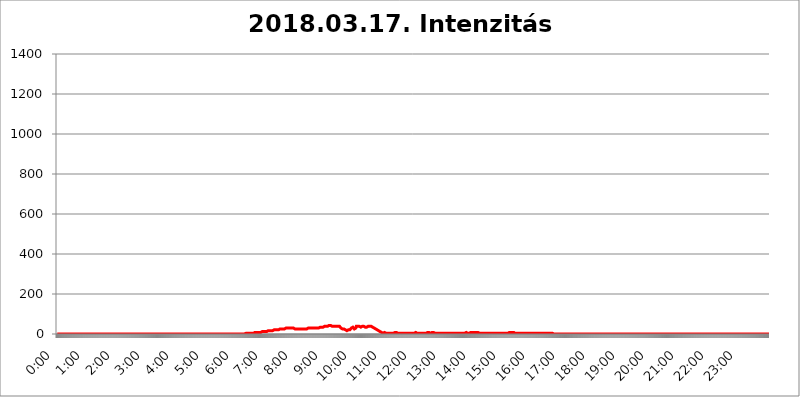
| Category | 2018.03.17. Intenzitás [W/m^2] |
|---|---|
| 0.0 | 0 |
| 0.0006944444444444445 | 0 |
| 0.001388888888888889 | 0 |
| 0.0020833333333333333 | 0 |
| 0.002777777777777778 | 0 |
| 0.003472222222222222 | 0 |
| 0.004166666666666667 | 0 |
| 0.004861111111111111 | 0 |
| 0.005555555555555556 | 0 |
| 0.0062499999999999995 | 0 |
| 0.006944444444444444 | 0 |
| 0.007638888888888889 | 0 |
| 0.008333333333333333 | 0 |
| 0.009027777777777779 | 0 |
| 0.009722222222222222 | 0 |
| 0.010416666666666666 | 0 |
| 0.011111111111111112 | 0 |
| 0.011805555555555555 | 0 |
| 0.012499999999999999 | 0 |
| 0.013194444444444444 | 0 |
| 0.013888888888888888 | 0 |
| 0.014583333333333332 | 0 |
| 0.015277777777777777 | 0 |
| 0.015972222222222224 | 0 |
| 0.016666666666666666 | 0 |
| 0.017361111111111112 | 0 |
| 0.018055555555555557 | 0 |
| 0.01875 | 0 |
| 0.019444444444444445 | 0 |
| 0.02013888888888889 | 0 |
| 0.020833333333333332 | 0 |
| 0.02152777777777778 | 0 |
| 0.022222222222222223 | 0 |
| 0.02291666666666667 | 0 |
| 0.02361111111111111 | 0 |
| 0.024305555555555556 | 0 |
| 0.024999999999999998 | 0 |
| 0.025694444444444447 | 0 |
| 0.02638888888888889 | 0 |
| 0.027083333333333334 | 0 |
| 0.027777777777777776 | 0 |
| 0.02847222222222222 | 0 |
| 0.029166666666666664 | 0 |
| 0.029861111111111113 | 0 |
| 0.030555555555555555 | 0 |
| 0.03125 | 0 |
| 0.03194444444444445 | 0 |
| 0.03263888888888889 | 0 |
| 0.03333333333333333 | 0 |
| 0.034027777777777775 | 0 |
| 0.034722222222222224 | 0 |
| 0.035416666666666666 | 0 |
| 0.036111111111111115 | 0 |
| 0.03680555555555556 | 0 |
| 0.0375 | 0 |
| 0.03819444444444444 | 0 |
| 0.03888888888888889 | 0 |
| 0.03958333333333333 | 0 |
| 0.04027777777777778 | 0 |
| 0.04097222222222222 | 0 |
| 0.041666666666666664 | 0 |
| 0.042361111111111106 | 0 |
| 0.04305555555555556 | 0 |
| 0.043750000000000004 | 0 |
| 0.044444444444444446 | 0 |
| 0.04513888888888889 | 0 |
| 0.04583333333333334 | 0 |
| 0.04652777777777778 | 0 |
| 0.04722222222222222 | 0 |
| 0.04791666666666666 | 0 |
| 0.04861111111111111 | 0 |
| 0.049305555555555554 | 0 |
| 0.049999999999999996 | 0 |
| 0.05069444444444445 | 0 |
| 0.051388888888888894 | 0 |
| 0.052083333333333336 | 0 |
| 0.05277777777777778 | 0 |
| 0.05347222222222222 | 0 |
| 0.05416666666666667 | 0 |
| 0.05486111111111111 | 0 |
| 0.05555555555555555 | 0 |
| 0.05625 | 0 |
| 0.05694444444444444 | 0 |
| 0.057638888888888885 | 0 |
| 0.05833333333333333 | 0 |
| 0.05902777777777778 | 0 |
| 0.059722222222222225 | 0 |
| 0.06041666666666667 | 0 |
| 0.061111111111111116 | 0 |
| 0.06180555555555556 | 0 |
| 0.0625 | 0 |
| 0.06319444444444444 | 0 |
| 0.06388888888888888 | 0 |
| 0.06458333333333334 | 0 |
| 0.06527777777777778 | 0 |
| 0.06597222222222222 | 0 |
| 0.06666666666666667 | 0 |
| 0.06736111111111111 | 0 |
| 0.06805555555555555 | 0 |
| 0.06874999999999999 | 0 |
| 0.06944444444444443 | 0 |
| 0.07013888888888889 | 0 |
| 0.07083333333333333 | 0 |
| 0.07152777777777779 | 0 |
| 0.07222222222222223 | 0 |
| 0.07291666666666667 | 0 |
| 0.07361111111111111 | 0 |
| 0.07430555555555556 | 0 |
| 0.075 | 0 |
| 0.07569444444444444 | 0 |
| 0.0763888888888889 | 0 |
| 0.07708333333333334 | 0 |
| 0.07777777777777778 | 0 |
| 0.07847222222222222 | 0 |
| 0.07916666666666666 | 0 |
| 0.0798611111111111 | 0 |
| 0.08055555555555556 | 0 |
| 0.08125 | 0 |
| 0.08194444444444444 | 0 |
| 0.08263888888888889 | 0 |
| 0.08333333333333333 | 0 |
| 0.08402777777777777 | 0 |
| 0.08472222222222221 | 0 |
| 0.08541666666666665 | 0 |
| 0.08611111111111112 | 0 |
| 0.08680555555555557 | 0 |
| 0.08750000000000001 | 0 |
| 0.08819444444444445 | 0 |
| 0.08888888888888889 | 0 |
| 0.08958333333333333 | 0 |
| 0.09027777777777778 | 0 |
| 0.09097222222222222 | 0 |
| 0.09166666666666667 | 0 |
| 0.09236111111111112 | 0 |
| 0.09305555555555556 | 0 |
| 0.09375 | 0 |
| 0.09444444444444444 | 0 |
| 0.09513888888888888 | 0 |
| 0.09583333333333333 | 0 |
| 0.09652777777777777 | 0 |
| 0.09722222222222222 | 0 |
| 0.09791666666666667 | 0 |
| 0.09861111111111111 | 0 |
| 0.09930555555555555 | 0 |
| 0.09999999999999999 | 0 |
| 0.10069444444444443 | 0 |
| 0.1013888888888889 | 0 |
| 0.10208333333333335 | 0 |
| 0.10277777777777779 | 0 |
| 0.10347222222222223 | 0 |
| 0.10416666666666667 | 0 |
| 0.10486111111111111 | 0 |
| 0.10555555555555556 | 0 |
| 0.10625 | 0 |
| 0.10694444444444444 | 0 |
| 0.1076388888888889 | 0 |
| 0.10833333333333334 | 0 |
| 0.10902777777777778 | 0 |
| 0.10972222222222222 | 0 |
| 0.1111111111111111 | 0 |
| 0.11180555555555556 | 0 |
| 0.11180555555555556 | 0 |
| 0.1125 | 0 |
| 0.11319444444444444 | 0 |
| 0.11388888888888889 | 0 |
| 0.11458333333333333 | 0 |
| 0.11527777777777777 | 0 |
| 0.11597222222222221 | 0 |
| 0.11666666666666665 | 0 |
| 0.1173611111111111 | 0 |
| 0.11805555555555557 | 0 |
| 0.11944444444444445 | 0 |
| 0.12013888888888889 | 0 |
| 0.12083333333333333 | 0 |
| 0.12152777777777778 | 0 |
| 0.12222222222222223 | 0 |
| 0.12291666666666667 | 0 |
| 0.12291666666666667 | 0 |
| 0.12361111111111112 | 0 |
| 0.12430555555555556 | 0 |
| 0.125 | 0 |
| 0.12569444444444444 | 0 |
| 0.12638888888888888 | 0 |
| 0.12708333333333333 | 0 |
| 0.16875 | 0 |
| 0.12847222222222224 | 0 |
| 0.12916666666666668 | 0 |
| 0.12986111111111112 | 0 |
| 0.13055555555555556 | 0 |
| 0.13125 | 0 |
| 0.13194444444444445 | 0 |
| 0.1326388888888889 | 0 |
| 0.13333333333333333 | 0 |
| 0.13402777777777777 | 0 |
| 0.13402777777777777 | 0 |
| 0.13472222222222222 | 0 |
| 0.13541666666666666 | 0 |
| 0.1361111111111111 | 0 |
| 0.13749999999999998 | 0 |
| 0.13819444444444443 | 0 |
| 0.1388888888888889 | 0 |
| 0.13958333333333334 | 0 |
| 0.14027777777777778 | 0 |
| 0.14097222222222222 | 0 |
| 0.14166666666666666 | 0 |
| 0.1423611111111111 | 0 |
| 0.14305555555555557 | 0 |
| 0.14375000000000002 | 0 |
| 0.14444444444444446 | 0 |
| 0.1451388888888889 | 0 |
| 0.1451388888888889 | 0 |
| 0.14652777777777778 | 0 |
| 0.14722222222222223 | 0 |
| 0.14791666666666667 | 0 |
| 0.1486111111111111 | 0 |
| 0.14930555555555555 | 0 |
| 0.15 | 0 |
| 0.15069444444444444 | 0 |
| 0.15138888888888888 | 0 |
| 0.15208333333333332 | 0 |
| 0.15277777777777776 | 0 |
| 0.15347222222222223 | 0 |
| 0.15416666666666667 | 0 |
| 0.15486111111111112 | 0 |
| 0.15555555555555556 | 0 |
| 0.15625 | 0 |
| 0.15694444444444444 | 0 |
| 0.15763888888888888 | 0 |
| 0.15833333333333333 | 0 |
| 0.15902777777777777 | 0 |
| 0.15972222222222224 | 0 |
| 0.16041666666666668 | 0 |
| 0.16111111111111112 | 0 |
| 0.16180555555555556 | 0 |
| 0.1625 | 0 |
| 0.16319444444444445 | 0 |
| 0.1638888888888889 | 0 |
| 0.16458333333333333 | 0 |
| 0.16527777777777777 | 0 |
| 0.16597222222222222 | 0 |
| 0.16666666666666666 | 0 |
| 0.1673611111111111 | 0 |
| 0.16805555555555554 | 0 |
| 0.16874999999999998 | 0 |
| 0.16944444444444443 | 0 |
| 0.17013888888888887 | 0 |
| 0.1708333333333333 | 0 |
| 0.17152777777777775 | 0 |
| 0.17222222222222225 | 0 |
| 0.1729166666666667 | 0 |
| 0.17361111111111113 | 0 |
| 0.17430555555555557 | 0 |
| 0.17500000000000002 | 0 |
| 0.17569444444444446 | 0 |
| 0.1763888888888889 | 0 |
| 0.17708333333333334 | 0 |
| 0.17777777777777778 | 0 |
| 0.17847222222222223 | 0 |
| 0.17916666666666667 | 0 |
| 0.1798611111111111 | 0 |
| 0.18055555555555555 | 0 |
| 0.18125 | 0 |
| 0.18194444444444444 | 0 |
| 0.1826388888888889 | 0 |
| 0.18333333333333335 | 0 |
| 0.1840277777777778 | 0 |
| 0.18472222222222223 | 0 |
| 0.18541666666666667 | 0 |
| 0.18611111111111112 | 0 |
| 0.18680555555555556 | 0 |
| 0.1875 | 0 |
| 0.18819444444444444 | 0 |
| 0.18888888888888888 | 0 |
| 0.18958333333333333 | 0 |
| 0.19027777777777777 | 0 |
| 0.1909722222222222 | 0 |
| 0.19166666666666665 | 0 |
| 0.19236111111111112 | 0 |
| 0.19305555555555554 | 0 |
| 0.19375 | 0 |
| 0.19444444444444445 | 0 |
| 0.1951388888888889 | 0 |
| 0.19583333333333333 | 0 |
| 0.19652777777777777 | 0 |
| 0.19722222222222222 | 0 |
| 0.19791666666666666 | 0 |
| 0.1986111111111111 | 0 |
| 0.19930555555555554 | 0 |
| 0.19999999999999998 | 0 |
| 0.20069444444444443 | 0 |
| 0.20138888888888887 | 0 |
| 0.2020833333333333 | 0 |
| 0.2027777777777778 | 0 |
| 0.2034722222222222 | 0 |
| 0.2041666666666667 | 0 |
| 0.20486111111111113 | 0 |
| 0.20555555555555557 | 0 |
| 0.20625000000000002 | 0 |
| 0.20694444444444446 | 0 |
| 0.2076388888888889 | 0 |
| 0.20833333333333334 | 0 |
| 0.20902777777777778 | 0 |
| 0.20972222222222223 | 0 |
| 0.21041666666666667 | 0 |
| 0.2111111111111111 | 0 |
| 0.21180555555555555 | 0 |
| 0.2125 | 0 |
| 0.21319444444444444 | 0 |
| 0.2138888888888889 | 0 |
| 0.21458333333333335 | 0 |
| 0.2152777777777778 | 0 |
| 0.21597222222222223 | 0 |
| 0.21666666666666667 | 0 |
| 0.21736111111111112 | 0 |
| 0.21805555555555556 | 0 |
| 0.21875 | 0 |
| 0.21944444444444444 | 0 |
| 0.22013888888888888 | 0 |
| 0.22083333333333333 | 0 |
| 0.22152777777777777 | 0 |
| 0.2222222222222222 | 0 |
| 0.22291666666666665 | 0 |
| 0.2236111111111111 | 0 |
| 0.22430555555555556 | 0 |
| 0.225 | 0 |
| 0.22569444444444445 | 0 |
| 0.2263888888888889 | 0 |
| 0.22708333333333333 | 0 |
| 0.22777777777777777 | 0 |
| 0.22847222222222222 | 0 |
| 0.22916666666666666 | 0 |
| 0.2298611111111111 | 0 |
| 0.23055555555555554 | 0 |
| 0.23124999999999998 | 0 |
| 0.23194444444444443 | 0 |
| 0.23263888888888887 | 0 |
| 0.2333333333333333 | 0 |
| 0.2340277777777778 | 0 |
| 0.2347222222222222 | 0 |
| 0.2354166666666667 | 0 |
| 0.23611111111111113 | 0 |
| 0.23680555555555557 | 0 |
| 0.23750000000000002 | 0 |
| 0.23819444444444446 | 0 |
| 0.2388888888888889 | 0 |
| 0.23958333333333334 | 0 |
| 0.24027777777777778 | 0 |
| 0.24097222222222223 | 0 |
| 0.24166666666666667 | 0 |
| 0.2423611111111111 | 0 |
| 0.24305555555555555 | 0 |
| 0.24375 | 0 |
| 0.24444444444444446 | 0 |
| 0.24513888888888888 | 0 |
| 0.24583333333333335 | 0 |
| 0.2465277777777778 | 0 |
| 0.24722222222222223 | 0 |
| 0.24791666666666667 | 0 |
| 0.24861111111111112 | 0 |
| 0.24930555555555556 | 0 |
| 0.25 | 0 |
| 0.25069444444444444 | 0 |
| 0.2513888888888889 | 0 |
| 0.2520833333333333 | 0 |
| 0.25277777777777777 | 0 |
| 0.2534722222222222 | 0 |
| 0.25416666666666665 | 0 |
| 0.2548611111111111 | 0 |
| 0.2555555555555556 | 0 |
| 0.25625000000000003 | 0 |
| 0.2569444444444445 | 0 |
| 0.2576388888888889 | 0 |
| 0.25833333333333336 | 0 |
| 0.2590277777777778 | 0 |
| 0.25972222222222224 | 0 |
| 0.2604166666666667 | 0 |
| 0.2611111111111111 | 0 |
| 0.26180555555555557 | 0 |
| 0.2625 | 0 |
| 0.26319444444444445 | 3.525 |
| 0.2638888888888889 | 3.525 |
| 0.26458333333333334 | 3.525 |
| 0.2652777777777778 | 3.525 |
| 0.2659722222222222 | 3.525 |
| 0.26666666666666666 | 3.525 |
| 0.2673611111111111 | 3.525 |
| 0.26805555555555555 | 3.525 |
| 0.26875 | 3.525 |
| 0.26944444444444443 | 3.525 |
| 0.2701388888888889 | 3.525 |
| 0.2708333333333333 | 3.525 |
| 0.27152777777777776 | 3.525 |
| 0.2722222222222222 | 3.525 |
| 0.27291666666666664 | 3.525 |
| 0.2736111111111111 | 3.525 |
| 0.2743055555555555 | 3.525 |
| 0.27499999999999997 | 3.525 |
| 0.27569444444444446 | 7.887 |
| 0.27638888888888885 | 7.887 |
| 0.27708333333333335 | 7.887 |
| 0.2777777777777778 | 7.887 |
| 0.27847222222222223 | 7.887 |
| 0.2791666666666667 | 7.887 |
| 0.2798611111111111 | 7.887 |
| 0.28055555555555556 | 7.887 |
| 0.28125 | 7.887 |
| 0.28194444444444444 | 7.887 |
| 0.2826388888888889 | 7.887 |
| 0.2833333333333333 | 7.887 |
| 0.28402777777777777 | 12.257 |
| 0.2847222222222222 | 12.257 |
| 0.28541666666666665 | 7.887 |
| 0.28611111111111115 | 12.257 |
| 0.28680555555555554 | 12.257 |
| 0.28750000000000003 | 12.257 |
| 0.2881944444444445 | 12.257 |
| 0.2888888888888889 | 12.257 |
| 0.28958333333333336 | 12.257 |
| 0.2902777777777778 | 12.257 |
| 0.29097222222222224 | 12.257 |
| 0.2916666666666667 | 12.257 |
| 0.2923611111111111 | 12.257 |
| 0.29305555555555557 | 12.257 |
| 0.29375 | 12.257 |
| 0.29444444444444445 | 16.636 |
| 0.2951388888888889 | 12.257 |
| 0.29583333333333334 | 16.636 |
| 0.2965277777777778 | 16.636 |
| 0.2972222222222222 | 16.636 |
| 0.29791666666666666 | 16.636 |
| 0.2986111111111111 | 16.636 |
| 0.29930555555555555 | 16.636 |
| 0.3 | 16.636 |
| 0.30069444444444443 | 16.636 |
| 0.3013888888888889 | 16.636 |
| 0.3020833333333333 | 16.636 |
| 0.30277777777777776 | 16.636 |
| 0.3034722222222222 | 16.636 |
| 0.30416666666666664 | 21.024 |
| 0.3048611111111111 | 21.024 |
| 0.3055555555555555 | 21.024 |
| 0.30624999999999997 | 21.024 |
| 0.3069444444444444 | 21.024 |
| 0.3076388888888889 | 21.024 |
| 0.30833333333333335 | 21.024 |
| 0.3090277777777778 | 21.024 |
| 0.30972222222222223 | 21.024 |
| 0.3104166666666667 | 21.024 |
| 0.3111111111111111 | 21.024 |
| 0.31180555555555556 | 21.024 |
| 0.3125 | 25.419 |
| 0.31319444444444444 | 25.419 |
| 0.3138888888888889 | 25.419 |
| 0.3145833333333333 | 25.419 |
| 0.31527777777777777 | 25.419 |
| 0.3159722222222222 | 25.419 |
| 0.31666666666666665 | 25.419 |
| 0.31736111111111115 | 25.419 |
| 0.31805555555555554 | 25.419 |
| 0.31875000000000003 | 25.419 |
| 0.3194444444444445 | 29.823 |
| 0.3201388888888889 | 29.823 |
| 0.32083333333333336 | 29.823 |
| 0.3215277777777778 | 29.823 |
| 0.32222222222222224 | 29.823 |
| 0.3229166666666667 | 29.823 |
| 0.3236111111111111 | 29.823 |
| 0.32430555555555557 | 29.823 |
| 0.325 | 29.823 |
| 0.32569444444444445 | 29.823 |
| 0.3263888888888889 | 29.823 |
| 0.32708333333333334 | 29.823 |
| 0.3277777777777778 | 29.823 |
| 0.3284722222222222 | 29.823 |
| 0.32916666666666666 | 29.823 |
| 0.3298611111111111 | 29.823 |
| 0.33055555555555555 | 29.823 |
| 0.33125 | 29.823 |
| 0.33194444444444443 | 29.823 |
| 0.3326388888888889 | 29.823 |
| 0.3333333333333333 | 25.419 |
| 0.3340277777777778 | 29.823 |
| 0.3347222222222222 | 25.419 |
| 0.3354166666666667 | 25.419 |
| 0.3361111111111111 | 25.419 |
| 0.3368055555555556 | 25.419 |
| 0.33749999999999997 | 25.419 |
| 0.33819444444444446 | 25.419 |
| 0.33888888888888885 | 25.419 |
| 0.33958333333333335 | 25.419 |
| 0.34027777777777773 | 25.419 |
| 0.34097222222222223 | 25.419 |
| 0.3416666666666666 | 25.419 |
| 0.3423611111111111 | 25.419 |
| 0.3430555555555555 | 25.419 |
| 0.34375 | 25.419 |
| 0.3444444444444445 | 25.419 |
| 0.3451388888888889 | 25.419 |
| 0.3458333333333334 | 25.419 |
| 0.34652777777777777 | 25.419 |
| 0.34722222222222227 | 25.419 |
| 0.34791666666666665 | 25.419 |
| 0.34861111111111115 | 25.419 |
| 0.34930555555555554 | 25.419 |
| 0.35000000000000003 | 25.419 |
| 0.3506944444444444 | 29.823 |
| 0.3513888888888889 | 29.823 |
| 0.3520833333333333 | 29.823 |
| 0.3527777777777778 | 29.823 |
| 0.3534722222222222 | 29.823 |
| 0.3541666666666667 | 29.823 |
| 0.3548611111111111 | 29.823 |
| 0.35555555555555557 | 29.823 |
| 0.35625 | 29.823 |
| 0.35694444444444445 | 29.823 |
| 0.3576388888888889 | 29.823 |
| 0.35833333333333334 | 29.823 |
| 0.3590277777777778 | 29.823 |
| 0.3597222222222222 | 29.823 |
| 0.36041666666666666 | 29.823 |
| 0.3611111111111111 | 29.823 |
| 0.36180555555555555 | 29.823 |
| 0.3625 | 29.823 |
| 0.36319444444444443 | 29.823 |
| 0.3638888888888889 | 29.823 |
| 0.3645833333333333 | 29.823 |
| 0.3652777777777778 | 29.823 |
| 0.3659722222222222 | 29.823 |
| 0.3666666666666667 | 29.823 |
| 0.3673611111111111 | 29.823 |
| 0.3680555555555556 | 34.234 |
| 0.36874999999999997 | 34.234 |
| 0.36944444444444446 | 34.234 |
| 0.37013888888888885 | 34.234 |
| 0.37083333333333335 | 34.234 |
| 0.37152777777777773 | 34.234 |
| 0.37222222222222223 | 34.234 |
| 0.3729166666666666 | 34.234 |
| 0.3736111111111111 | 34.234 |
| 0.3743055555555555 | 34.234 |
| 0.375 | 38.653 |
| 0.3756944444444445 | 38.653 |
| 0.3763888888888889 | 38.653 |
| 0.3770833333333334 | 38.653 |
| 0.37777777777777777 | 38.653 |
| 0.37847222222222227 | 38.653 |
| 0.37916666666666665 | 38.653 |
| 0.37986111111111115 | 38.653 |
| 0.38055555555555554 | 38.653 |
| 0.38125000000000003 | 43.079 |
| 0.3819444444444444 | 43.079 |
| 0.3826388888888889 | 43.079 |
| 0.3833333333333333 | 43.079 |
| 0.3840277777777778 | 43.079 |
| 0.3847222222222222 | 38.653 |
| 0.3854166666666667 | 38.653 |
| 0.3861111111111111 | 38.653 |
| 0.38680555555555557 | 38.653 |
| 0.3875 | 38.653 |
| 0.38819444444444445 | 38.653 |
| 0.3888888888888889 | 38.653 |
| 0.38958333333333334 | 38.653 |
| 0.3902777777777778 | 38.653 |
| 0.3909722222222222 | 38.653 |
| 0.39166666666666666 | 38.653 |
| 0.3923611111111111 | 38.653 |
| 0.39305555555555555 | 38.653 |
| 0.39375 | 38.653 |
| 0.39444444444444443 | 38.653 |
| 0.3951388888888889 | 43.079 |
| 0.3958333333333333 | 38.653 |
| 0.3965277777777778 | 38.653 |
| 0.3972222222222222 | 34.234 |
| 0.3979166666666667 | 29.823 |
| 0.3986111111111111 | 25.419 |
| 0.3993055555555556 | 25.419 |
| 0.39999999999999997 | 25.419 |
| 0.40069444444444446 | 29.823 |
| 0.40138888888888885 | 25.419 |
| 0.40208333333333335 | 25.419 |
| 0.40277777777777773 | 21.024 |
| 0.40347222222222223 | 25.419 |
| 0.4041666666666666 | 21.024 |
| 0.4048611111111111 | 21.024 |
| 0.4055555555555555 | 21.024 |
| 0.40625 | 16.636 |
| 0.4069444444444445 | 16.636 |
| 0.4076388888888889 | 21.024 |
| 0.4083333333333334 | 21.024 |
| 0.40902777777777777 | 21.024 |
| 0.40972222222222227 | 21.024 |
| 0.41041666666666665 | 21.024 |
| 0.41111111111111115 | 21.024 |
| 0.41180555555555554 | 21.024 |
| 0.41250000000000003 | 29.823 |
| 0.4131944444444444 | 29.823 |
| 0.4138888888888889 | 29.823 |
| 0.4145833333333333 | 34.234 |
| 0.4152777777777778 | 29.823 |
| 0.4159722222222222 | 29.823 |
| 0.4166666666666667 | 25.419 |
| 0.4173611111111111 | 21.024 |
| 0.41805555555555557 | 21.024 |
| 0.41875 | 29.823 |
| 0.41944444444444445 | 38.653 |
| 0.4201388888888889 | 38.653 |
| 0.42083333333333334 | 38.653 |
| 0.4215277777777778 | 38.653 |
| 0.4222222222222222 | 38.653 |
| 0.42291666666666666 | 38.653 |
| 0.4236111111111111 | 38.653 |
| 0.42430555555555555 | 34.234 |
| 0.425 | 34.234 |
| 0.42569444444444443 | 34.234 |
| 0.4263888888888889 | 34.234 |
| 0.4270833333333333 | 38.653 |
| 0.4277777777777778 | 38.653 |
| 0.4284722222222222 | 38.653 |
| 0.4291666666666667 | 38.653 |
| 0.4298611111111111 | 38.653 |
| 0.4305555555555556 | 38.653 |
| 0.43124999999999997 | 34.234 |
| 0.43194444444444446 | 34.234 |
| 0.43263888888888885 | 34.234 |
| 0.43333333333333335 | 34.234 |
| 0.43402777777777773 | 34.234 |
| 0.43472222222222223 | 38.653 |
| 0.4354166666666666 | 38.653 |
| 0.4361111111111111 | 38.653 |
| 0.4368055555555555 | 38.653 |
| 0.4375 | 38.653 |
| 0.4381944444444445 | 38.653 |
| 0.4388888888888889 | 38.653 |
| 0.4395833333333334 | 38.653 |
| 0.44027777777777777 | 38.653 |
| 0.44097222222222227 | 34.234 |
| 0.44166666666666665 | 34.234 |
| 0.44236111111111115 | 34.234 |
| 0.44305555555555554 | 34.234 |
| 0.44375000000000003 | 34.234 |
| 0.4444444444444444 | 29.823 |
| 0.4451388888888889 | 29.823 |
| 0.4458333333333333 | 25.419 |
| 0.4465277777777778 | 25.419 |
| 0.4472222222222222 | 25.419 |
| 0.4479166666666667 | 21.024 |
| 0.4486111111111111 | 21.024 |
| 0.44930555555555557 | 21.024 |
| 0.45 | 16.636 |
| 0.45069444444444445 | 16.636 |
| 0.4513888888888889 | 12.257 |
| 0.45208333333333334 | 12.257 |
| 0.4527777777777778 | 12.257 |
| 0.4534722222222222 | 12.257 |
| 0.45416666666666666 | 12.257 |
| 0.4548611111111111 | 7.887 |
| 0.45555555555555555 | 7.887 |
| 0.45625 | 7.887 |
| 0.45694444444444443 | 3.525 |
| 0.4576388888888889 | 7.887 |
| 0.4583333333333333 | 7.887 |
| 0.4590277777777778 | 7.887 |
| 0.4597222222222222 | 7.887 |
| 0.4604166666666667 | 3.525 |
| 0.4611111111111111 | 3.525 |
| 0.4618055555555556 | 3.525 |
| 0.46249999999999997 | 3.525 |
| 0.46319444444444446 | 3.525 |
| 0.46388888888888885 | 3.525 |
| 0.46458333333333335 | 3.525 |
| 0.46527777777777773 | 3.525 |
| 0.46597222222222223 | 3.525 |
| 0.4666666666666666 | 3.525 |
| 0.4673611111111111 | 3.525 |
| 0.4680555555555555 | 3.525 |
| 0.46875 | 3.525 |
| 0.4694444444444445 | 3.525 |
| 0.4701388888888889 | 3.525 |
| 0.4708333333333334 | 3.525 |
| 0.47152777777777777 | 3.525 |
| 0.47222222222222227 | 3.525 |
| 0.47291666666666665 | 3.525 |
| 0.47361111111111115 | 7.887 |
| 0.47430555555555554 | 7.887 |
| 0.47500000000000003 | 7.887 |
| 0.4756944444444444 | 7.887 |
| 0.4763888888888889 | 7.887 |
| 0.4770833333333333 | 7.887 |
| 0.4777777777777778 | 3.525 |
| 0.4784722222222222 | 7.887 |
| 0.4791666666666667 | 7.887 |
| 0.4798611111111111 | 3.525 |
| 0.48055555555555557 | 7.887 |
| 0.48125 | 3.525 |
| 0.48194444444444445 | 3.525 |
| 0.4826388888888889 | 3.525 |
| 0.48333333333333334 | 3.525 |
| 0.4840277777777778 | 3.525 |
| 0.4847222222222222 | 3.525 |
| 0.48541666666666666 | 3.525 |
| 0.4861111111111111 | 3.525 |
| 0.48680555555555555 | 3.525 |
| 0.4875 | 3.525 |
| 0.48819444444444443 | 3.525 |
| 0.4888888888888889 | 3.525 |
| 0.4895833333333333 | 3.525 |
| 0.4902777777777778 | 3.525 |
| 0.4909722222222222 | 3.525 |
| 0.4916666666666667 | 3.525 |
| 0.4923611111111111 | 3.525 |
| 0.4930555555555556 | 3.525 |
| 0.49374999999999997 | 3.525 |
| 0.49444444444444446 | 3.525 |
| 0.49513888888888885 | 3.525 |
| 0.49583333333333335 | 3.525 |
| 0.49652777777777773 | 3.525 |
| 0.49722222222222223 | 3.525 |
| 0.4979166666666666 | 3.525 |
| 0.4986111111111111 | 3.525 |
| 0.4993055555555555 | 3.525 |
| 0.5 | 3.525 |
| 0.5006944444444444 | 3.525 |
| 0.5013888888888889 | 7.887 |
| 0.5020833333333333 | 3.525 |
| 0.5027777777777778 | 7.887 |
| 0.5034722222222222 | 7.887 |
| 0.5041666666666667 | 3.525 |
| 0.5048611111111111 | 3.525 |
| 0.5055555555555555 | 3.525 |
| 0.50625 | 3.525 |
| 0.5069444444444444 | 3.525 |
| 0.5076388888888889 | 3.525 |
| 0.5083333333333333 | 3.525 |
| 0.5090277777777777 | 3.525 |
| 0.5097222222222222 | 3.525 |
| 0.5104166666666666 | 3.525 |
| 0.5111111111111112 | 3.525 |
| 0.5118055555555555 | 3.525 |
| 0.5125000000000001 | 3.525 |
| 0.5131944444444444 | 3.525 |
| 0.513888888888889 | 3.525 |
| 0.5145833333333333 | 3.525 |
| 0.5152777777777778 | 3.525 |
| 0.5159722222222222 | 3.525 |
| 0.5166666666666667 | 3.525 |
| 0.517361111111111 | 3.525 |
| 0.5180555555555556 | 3.525 |
| 0.5187499999999999 | 3.525 |
| 0.5194444444444445 | 7.887 |
| 0.5201388888888888 | 7.887 |
| 0.5208333333333334 | 7.887 |
| 0.5215277777777778 | 7.887 |
| 0.5222222222222223 | 7.887 |
| 0.5229166666666667 | 7.887 |
| 0.5236111111111111 | 3.525 |
| 0.5243055555555556 | 3.525 |
| 0.525 | 7.887 |
| 0.5256944444444445 | 7.887 |
| 0.5263888888888889 | 7.887 |
| 0.5270833333333333 | 3.525 |
| 0.5277777777777778 | 7.887 |
| 0.5284722222222222 | 3.525 |
| 0.5291666666666667 | 3.525 |
| 0.5298611111111111 | 3.525 |
| 0.5305555555555556 | 3.525 |
| 0.53125 | 3.525 |
| 0.5319444444444444 | 3.525 |
| 0.5326388888888889 | 3.525 |
| 0.5333333333333333 | 3.525 |
| 0.5340277777777778 | 3.525 |
| 0.5347222222222222 | 3.525 |
| 0.5354166666666667 | 3.525 |
| 0.5361111111111111 | 3.525 |
| 0.5368055555555555 | 3.525 |
| 0.5375 | 3.525 |
| 0.5381944444444444 | 3.525 |
| 0.5388888888888889 | 3.525 |
| 0.5395833333333333 | 3.525 |
| 0.5402777777777777 | 3.525 |
| 0.5409722222222222 | 3.525 |
| 0.5416666666666666 | 3.525 |
| 0.5423611111111112 | 3.525 |
| 0.5430555555555555 | 3.525 |
| 0.5437500000000001 | 3.525 |
| 0.5444444444444444 | 3.525 |
| 0.545138888888889 | 3.525 |
| 0.5458333333333333 | 3.525 |
| 0.5465277777777778 | 3.525 |
| 0.5472222222222222 | 3.525 |
| 0.5479166666666667 | 3.525 |
| 0.548611111111111 | 3.525 |
| 0.5493055555555556 | 3.525 |
| 0.5499999999999999 | 3.525 |
| 0.5506944444444445 | 3.525 |
| 0.5513888888888888 | 3.525 |
| 0.5520833333333334 | 3.525 |
| 0.5527777777777778 | 3.525 |
| 0.5534722222222223 | 3.525 |
| 0.5541666666666667 | 3.525 |
| 0.5548611111111111 | 3.525 |
| 0.5555555555555556 | 3.525 |
| 0.55625 | 3.525 |
| 0.5569444444444445 | 3.525 |
| 0.5576388888888889 | 3.525 |
| 0.5583333333333333 | 3.525 |
| 0.5590277777777778 | 3.525 |
| 0.5597222222222222 | 3.525 |
| 0.5604166666666667 | 3.525 |
| 0.5611111111111111 | 3.525 |
| 0.5618055555555556 | 3.525 |
| 0.5625 | 3.525 |
| 0.5631944444444444 | 3.525 |
| 0.5638888888888889 | 3.525 |
| 0.5645833333333333 | 3.525 |
| 0.5652777777777778 | 3.525 |
| 0.5659722222222222 | 3.525 |
| 0.5666666666666667 | 3.525 |
| 0.5673611111111111 | 3.525 |
| 0.5680555555555555 | 3.525 |
| 0.56875 | 7.887 |
| 0.5694444444444444 | 3.525 |
| 0.5701388888888889 | 3.525 |
| 0.5708333333333333 | 3.525 |
| 0.5715277777777777 | 3.525 |
| 0.5722222222222222 | 3.525 |
| 0.5729166666666666 | 3.525 |
| 0.5736111111111112 | 7.887 |
| 0.5743055555555555 | 7.887 |
| 0.5750000000000001 | 3.525 |
| 0.5756944444444444 | 3.525 |
| 0.576388888888889 | 3.525 |
| 0.5770833333333333 | 7.887 |
| 0.5777777777777778 | 3.525 |
| 0.5784722222222222 | 3.525 |
| 0.5791666666666667 | 7.887 |
| 0.579861111111111 | 7.887 |
| 0.5805555555555556 | 7.887 |
| 0.5812499999999999 | 7.887 |
| 0.5819444444444445 | 7.887 |
| 0.5826388888888888 | 7.887 |
| 0.5833333333333334 | 7.887 |
| 0.5840277777777778 | 7.887 |
| 0.5847222222222223 | 7.887 |
| 0.5854166666666667 | 7.887 |
| 0.5861111111111111 | 7.887 |
| 0.5868055555555556 | 7.887 |
| 0.5875 | 7.887 |
| 0.5881944444444445 | 7.887 |
| 0.5888888888888889 | 7.887 |
| 0.5895833333333333 | 3.525 |
| 0.5902777777777778 | 7.887 |
| 0.5909722222222222 | 3.525 |
| 0.5916666666666667 | 3.525 |
| 0.5923611111111111 | 3.525 |
| 0.5930555555555556 | 3.525 |
| 0.59375 | 3.525 |
| 0.5944444444444444 | 3.525 |
| 0.5951388888888889 | 3.525 |
| 0.5958333333333333 | 3.525 |
| 0.5965277777777778 | 3.525 |
| 0.5972222222222222 | 3.525 |
| 0.5979166666666667 | 3.525 |
| 0.5986111111111111 | 3.525 |
| 0.5993055555555555 | 3.525 |
| 0.6 | 3.525 |
| 0.6006944444444444 | 3.525 |
| 0.6013888888888889 | 3.525 |
| 0.6020833333333333 | 3.525 |
| 0.6027777777777777 | 3.525 |
| 0.6034722222222222 | 3.525 |
| 0.6041666666666666 | 3.525 |
| 0.6048611111111112 | 3.525 |
| 0.6055555555555555 | 3.525 |
| 0.6062500000000001 | 3.525 |
| 0.6069444444444444 | 3.525 |
| 0.607638888888889 | 3.525 |
| 0.6083333333333333 | 3.525 |
| 0.6090277777777778 | 3.525 |
| 0.6097222222222222 | 3.525 |
| 0.6104166666666667 | 3.525 |
| 0.611111111111111 | 3.525 |
| 0.6118055555555556 | 3.525 |
| 0.6124999999999999 | 3.525 |
| 0.6131944444444445 | 3.525 |
| 0.6138888888888888 | 3.525 |
| 0.6145833333333334 | 3.525 |
| 0.6152777777777778 | 3.525 |
| 0.6159722222222223 | 3.525 |
| 0.6166666666666667 | 3.525 |
| 0.6173611111111111 | 3.525 |
| 0.6180555555555556 | 3.525 |
| 0.61875 | 3.525 |
| 0.6194444444444445 | 3.525 |
| 0.6201388888888889 | 3.525 |
| 0.6208333333333333 | 3.525 |
| 0.6215277777777778 | 3.525 |
| 0.6222222222222222 | 3.525 |
| 0.6229166666666667 | 3.525 |
| 0.6236111111111111 | 3.525 |
| 0.6243055555555556 | 3.525 |
| 0.625 | 3.525 |
| 0.6256944444444444 | 3.525 |
| 0.6263888888888889 | 3.525 |
| 0.6270833333333333 | 3.525 |
| 0.6277777777777778 | 3.525 |
| 0.6284722222222222 | 3.525 |
| 0.6291666666666667 | 3.525 |
| 0.6298611111111111 | 3.525 |
| 0.6305555555555555 | 3.525 |
| 0.63125 | 3.525 |
| 0.6319444444444444 | 3.525 |
| 0.6326388888888889 | 3.525 |
| 0.6333333333333333 | 3.525 |
| 0.6340277777777777 | 7.887 |
| 0.6347222222222222 | 7.887 |
| 0.6354166666666666 | 7.887 |
| 0.6361111111111112 | 7.887 |
| 0.6368055555555555 | 3.525 |
| 0.6375000000000001 | 7.887 |
| 0.6381944444444444 | 7.887 |
| 0.638888888888889 | 7.887 |
| 0.6395833333333333 | 7.887 |
| 0.6402777777777778 | 7.887 |
| 0.6409722222222222 | 3.525 |
| 0.6416666666666667 | 7.887 |
| 0.642361111111111 | 3.525 |
| 0.6430555555555556 | 3.525 |
| 0.6437499999999999 | 3.525 |
| 0.6444444444444445 | 3.525 |
| 0.6451388888888888 | 3.525 |
| 0.6458333333333334 | 3.525 |
| 0.6465277777777778 | 3.525 |
| 0.6472222222222223 | 3.525 |
| 0.6479166666666667 | 3.525 |
| 0.6486111111111111 | 3.525 |
| 0.6493055555555556 | 3.525 |
| 0.65 | 3.525 |
| 0.6506944444444445 | 3.525 |
| 0.6513888888888889 | 3.525 |
| 0.6520833333333333 | 3.525 |
| 0.6527777777777778 | 3.525 |
| 0.6534722222222222 | 3.525 |
| 0.6541666666666667 | 3.525 |
| 0.6548611111111111 | 3.525 |
| 0.6555555555555556 | 3.525 |
| 0.65625 | 3.525 |
| 0.6569444444444444 | 3.525 |
| 0.6576388888888889 | 3.525 |
| 0.6583333333333333 | 3.525 |
| 0.6590277777777778 | 3.525 |
| 0.6597222222222222 | 3.525 |
| 0.6604166666666667 | 3.525 |
| 0.6611111111111111 | 3.525 |
| 0.6618055555555555 | 3.525 |
| 0.6625 | 3.525 |
| 0.6631944444444444 | 3.525 |
| 0.6638888888888889 | 3.525 |
| 0.6645833333333333 | 3.525 |
| 0.6652777777777777 | 3.525 |
| 0.6659722222222222 | 3.525 |
| 0.6666666666666666 | 3.525 |
| 0.6673611111111111 | 3.525 |
| 0.6680555555555556 | 3.525 |
| 0.6687500000000001 | 3.525 |
| 0.6694444444444444 | 3.525 |
| 0.6701388888888888 | 3.525 |
| 0.6708333333333334 | 3.525 |
| 0.6715277777777778 | 3.525 |
| 0.6722222222222222 | 3.525 |
| 0.6729166666666666 | 3.525 |
| 0.6736111111111112 | 3.525 |
| 0.6743055555555556 | 3.525 |
| 0.6749999999999999 | 3.525 |
| 0.6756944444444444 | 3.525 |
| 0.6763888888888889 | 3.525 |
| 0.6770833333333334 | 3.525 |
| 0.6777777777777777 | 3.525 |
| 0.6784722222222223 | 3.525 |
| 0.6791666666666667 | 3.525 |
| 0.6798611111111111 | 3.525 |
| 0.6805555555555555 | 3.525 |
| 0.68125 | 3.525 |
| 0.6819444444444445 | 3.525 |
| 0.6826388888888889 | 3.525 |
| 0.6833333333333332 | 3.525 |
| 0.6840277777777778 | 3.525 |
| 0.6847222222222222 | 3.525 |
| 0.6854166666666667 | 3.525 |
| 0.686111111111111 | 3.525 |
| 0.6868055555555556 | 3.525 |
| 0.6875 | 3.525 |
| 0.6881944444444444 | 3.525 |
| 0.688888888888889 | 3.525 |
| 0.6895833333333333 | 3.525 |
| 0.6902777777777778 | 3.525 |
| 0.6909722222222222 | 3.525 |
| 0.6916666666666668 | 3.525 |
| 0.6923611111111111 | 3.525 |
| 0.6930555555555555 | 3.525 |
| 0.69375 | 3.525 |
| 0.6944444444444445 | 3.525 |
| 0.6951388888888889 | 0 |
| 0.6958333333333333 | 0 |
| 0.6965277777777777 | 0 |
| 0.6972222222222223 | 0 |
| 0.6979166666666666 | 0 |
| 0.6986111111111111 | 0 |
| 0.6993055555555556 | 0 |
| 0.7000000000000001 | 0 |
| 0.7006944444444444 | 0 |
| 0.7013888888888888 | 0 |
| 0.7020833333333334 | 0 |
| 0.7027777777777778 | 0 |
| 0.7034722222222222 | 0 |
| 0.7041666666666666 | 0 |
| 0.7048611111111112 | 0 |
| 0.7055555555555556 | 0 |
| 0.7062499999999999 | 0 |
| 0.7069444444444444 | 0 |
| 0.7076388888888889 | 0 |
| 0.7083333333333334 | 0 |
| 0.7090277777777777 | 0 |
| 0.7097222222222223 | 0 |
| 0.7104166666666667 | 0 |
| 0.7111111111111111 | 0 |
| 0.7118055555555555 | 0 |
| 0.7125 | 0 |
| 0.7131944444444445 | 0 |
| 0.7138888888888889 | 0 |
| 0.7145833333333332 | 0 |
| 0.7152777777777778 | 0 |
| 0.7159722222222222 | 0 |
| 0.7166666666666667 | 0 |
| 0.717361111111111 | 0 |
| 0.7180555555555556 | 0 |
| 0.71875 | 0 |
| 0.7194444444444444 | 0 |
| 0.720138888888889 | 0 |
| 0.7208333333333333 | 0 |
| 0.7215277777777778 | 0 |
| 0.7222222222222222 | 0 |
| 0.7229166666666668 | 0 |
| 0.7236111111111111 | 0 |
| 0.7243055555555555 | 0 |
| 0.725 | 0 |
| 0.7256944444444445 | 0 |
| 0.7263888888888889 | 0 |
| 0.7270833333333333 | 0 |
| 0.7277777777777777 | 0 |
| 0.7284722222222223 | 0 |
| 0.7291666666666666 | 0 |
| 0.7298611111111111 | 0 |
| 0.7305555555555556 | 0 |
| 0.7312500000000001 | 0 |
| 0.7319444444444444 | 0 |
| 0.7326388888888888 | 0 |
| 0.7333333333333334 | 0 |
| 0.7340277777777778 | 0 |
| 0.7347222222222222 | 0 |
| 0.7354166666666666 | 0 |
| 0.7361111111111112 | 0 |
| 0.7368055555555556 | 0 |
| 0.7374999999999999 | 0 |
| 0.7381944444444444 | 0 |
| 0.7388888888888889 | 0 |
| 0.7395833333333334 | 0 |
| 0.7402777777777777 | 0 |
| 0.7409722222222223 | 0 |
| 0.7416666666666667 | 0 |
| 0.7423611111111111 | 0 |
| 0.7430555555555555 | 0 |
| 0.74375 | 0 |
| 0.7444444444444445 | 0 |
| 0.7451388888888889 | 0 |
| 0.7458333333333332 | 0 |
| 0.7465277777777778 | 0 |
| 0.7472222222222222 | 0 |
| 0.7479166666666667 | 0 |
| 0.748611111111111 | 0 |
| 0.7493055555555556 | 0 |
| 0.75 | 0 |
| 0.7506944444444444 | 0 |
| 0.751388888888889 | 0 |
| 0.7520833333333333 | 0 |
| 0.7527777777777778 | 0 |
| 0.7534722222222222 | 0 |
| 0.7541666666666668 | 0 |
| 0.7548611111111111 | 0 |
| 0.7555555555555555 | 0 |
| 0.75625 | 0 |
| 0.7569444444444445 | 0 |
| 0.7576388888888889 | 0 |
| 0.7583333333333333 | 0 |
| 0.7590277777777777 | 0 |
| 0.7597222222222223 | 0 |
| 0.7604166666666666 | 0 |
| 0.7611111111111111 | 0 |
| 0.7618055555555556 | 0 |
| 0.7625000000000001 | 0 |
| 0.7631944444444444 | 0 |
| 0.7638888888888888 | 0 |
| 0.7645833333333334 | 0 |
| 0.7652777777777778 | 0 |
| 0.7659722222222222 | 0 |
| 0.7666666666666666 | 0 |
| 0.7673611111111112 | 0 |
| 0.7680555555555556 | 0 |
| 0.7687499999999999 | 0 |
| 0.7694444444444444 | 0 |
| 0.7701388888888889 | 0 |
| 0.7708333333333334 | 0 |
| 0.7715277777777777 | 0 |
| 0.7722222222222223 | 0 |
| 0.7729166666666667 | 0 |
| 0.7736111111111111 | 0 |
| 0.7743055555555555 | 0 |
| 0.775 | 0 |
| 0.7756944444444445 | 0 |
| 0.7763888888888889 | 0 |
| 0.7770833333333332 | 0 |
| 0.7777777777777778 | 0 |
| 0.7784722222222222 | 0 |
| 0.7791666666666667 | 0 |
| 0.779861111111111 | 0 |
| 0.7805555555555556 | 0 |
| 0.78125 | 0 |
| 0.7819444444444444 | 0 |
| 0.782638888888889 | 0 |
| 0.7833333333333333 | 0 |
| 0.7840277777777778 | 0 |
| 0.7847222222222222 | 0 |
| 0.7854166666666668 | 0 |
| 0.7861111111111111 | 0 |
| 0.7868055555555555 | 0 |
| 0.7875 | 0 |
| 0.7881944444444445 | 0 |
| 0.7888888888888889 | 0 |
| 0.7895833333333333 | 0 |
| 0.7902777777777777 | 0 |
| 0.7909722222222223 | 0 |
| 0.7916666666666666 | 0 |
| 0.7923611111111111 | 0 |
| 0.7930555555555556 | 0 |
| 0.7937500000000001 | 0 |
| 0.7944444444444444 | 0 |
| 0.7951388888888888 | 0 |
| 0.7958333333333334 | 0 |
| 0.7965277777777778 | 0 |
| 0.7972222222222222 | 0 |
| 0.7979166666666666 | 0 |
| 0.7986111111111112 | 0 |
| 0.7993055555555556 | 0 |
| 0.7999999999999999 | 0 |
| 0.8006944444444444 | 0 |
| 0.8013888888888889 | 0 |
| 0.8020833333333334 | 0 |
| 0.8027777777777777 | 0 |
| 0.8034722222222223 | 0 |
| 0.8041666666666667 | 0 |
| 0.8048611111111111 | 0 |
| 0.8055555555555555 | 0 |
| 0.80625 | 0 |
| 0.8069444444444445 | 0 |
| 0.8076388888888889 | 0 |
| 0.8083333333333332 | 0 |
| 0.8090277777777778 | 0 |
| 0.8097222222222222 | 0 |
| 0.8104166666666667 | 0 |
| 0.811111111111111 | 0 |
| 0.8118055555555556 | 0 |
| 0.8125 | 0 |
| 0.8131944444444444 | 0 |
| 0.813888888888889 | 0 |
| 0.8145833333333333 | 0 |
| 0.8152777777777778 | 0 |
| 0.8159722222222222 | 0 |
| 0.8166666666666668 | 0 |
| 0.8173611111111111 | 0 |
| 0.8180555555555555 | 0 |
| 0.81875 | 0 |
| 0.8194444444444445 | 0 |
| 0.8201388888888889 | 0 |
| 0.8208333333333333 | 0 |
| 0.8215277777777777 | 0 |
| 0.8222222222222223 | 0 |
| 0.8229166666666666 | 0 |
| 0.8236111111111111 | 0 |
| 0.8243055555555556 | 0 |
| 0.8250000000000001 | 0 |
| 0.8256944444444444 | 0 |
| 0.8263888888888888 | 0 |
| 0.8270833333333334 | 0 |
| 0.8277777777777778 | 0 |
| 0.8284722222222222 | 0 |
| 0.8291666666666666 | 0 |
| 0.8298611111111112 | 0 |
| 0.8305555555555556 | 0 |
| 0.8312499999999999 | 0 |
| 0.8319444444444444 | 0 |
| 0.8326388888888889 | 0 |
| 0.8333333333333334 | 0 |
| 0.8340277777777777 | 0 |
| 0.8347222222222223 | 0 |
| 0.8354166666666667 | 0 |
| 0.8361111111111111 | 0 |
| 0.8368055555555555 | 0 |
| 0.8375 | 0 |
| 0.8381944444444445 | 0 |
| 0.8388888888888889 | 0 |
| 0.8395833333333332 | 0 |
| 0.8402777777777778 | 0 |
| 0.8409722222222222 | 0 |
| 0.8416666666666667 | 0 |
| 0.842361111111111 | 0 |
| 0.8430555555555556 | 0 |
| 0.84375 | 0 |
| 0.8444444444444444 | 0 |
| 0.845138888888889 | 0 |
| 0.8458333333333333 | 0 |
| 0.8465277777777778 | 0 |
| 0.8472222222222222 | 0 |
| 0.8479166666666668 | 0 |
| 0.8486111111111111 | 0 |
| 0.8493055555555555 | 0 |
| 0.85 | 0 |
| 0.8506944444444445 | 0 |
| 0.8513888888888889 | 0 |
| 0.8520833333333333 | 0 |
| 0.8527777777777777 | 0 |
| 0.8534722222222223 | 0 |
| 0.8541666666666666 | 0 |
| 0.8548611111111111 | 0 |
| 0.8555555555555556 | 0 |
| 0.8562500000000001 | 0 |
| 0.8569444444444444 | 0 |
| 0.8576388888888888 | 0 |
| 0.8583333333333334 | 0 |
| 0.8590277777777778 | 0 |
| 0.8597222222222222 | 0 |
| 0.8604166666666666 | 0 |
| 0.8611111111111112 | 0 |
| 0.8618055555555556 | 0 |
| 0.8624999999999999 | 0 |
| 0.8631944444444444 | 0 |
| 0.8638888888888889 | 0 |
| 0.8645833333333334 | 0 |
| 0.8652777777777777 | 0 |
| 0.8659722222222223 | 0 |
| 0.8666666666666667 | 0 |
| 0.8673611111111111 | 0 |
| 0.8680555555555555 | 0 |
| 0.86875 | 0 |
| 0.8694444444444445 | 0 |
| 0.8701388888888889 | 0 |
| 0.8708333333333332 | 0 |
| 0.8715277777777778 | 0 |
| 0.8722222222222222 | 0 |
| 0.8729166666666667 | 0 |
| 0.873611111111111 | 0 |
| 0.8743055555555556 | 0 |
| 0.875 | 0 |
| 0.8756944444444444 | 0 |
| 0.876388888888889 | 0 |
| 0.8770833333333333 | 0 |
| 0.8777777777777778 | 0 |
| 0.8784722222222222 | 0 |
| 0.8791666666666668 | 0 |
| 0.8798611111111111 | 0 |
| 0.8805555555555555 | 0 |
| 0.88125 | 0 |
| 0.8819444444444445 | 0 |
| 0.8826388888888889 | 0 |
| 0.8833333333333333 | 0 |
| 0.8840277777777777 | 0 |
| 0.8847222222222223 | 0 |
| 0.8854166666666666 | 0 |
| 0.8861111111111111 | 0 |
| 0.8868055555555556 | 0 |
| 0.8875000000000001 | 0 |
| 0.8881944444444444 | 0 |
| 0.8888888888888888 | 0 |
| 0.8895833333333334 | 0 |
| 0.8902777777777778 | 0 |
| 0.8909722222222222 | 0 |
| 0.8916666666666666 | 0 |
| 0.8923611111111112 | 0 |
| 0.8930555555555556 | 0 |
| 0.8937499999999999 | 0 |
| 0.8944444444444444 | 0 |
| 0.8951388888888889 | 0 |
| 0.8958333333333334 | 0 |
| 0.8965277777777777 | 0 |
| 0.8972222222222223 | 0 |
| 0.8979166666666667 | 0 |
| 0.8986111111111111 | 0 |
| 0.8993055555555555 | 0 |
| 0.9 | 0 |
| 0.9006944444444445 | 0 |
| 0.9013888888888889 | 0 |
| 0.9020833333333332 | 0 |
| 0.9027777777777778 | 0 |
| 0.9034722222222222 | 0 |
| 0.9041666666666667 | 0 |
| 0.904861111111111 | 0 |
| 0.9055555555555556 | 0 |
| 0.90625 | 0 |
| 0.9069444444444444 | 0 |
| 0.907638888888889 | 0 |
| 0.9083333333333333 | 0 |
| 0.9090277777777778 | 0 |
| 0.9097222222222222 | 0 |
| 0.9104166666666668 | 0 |
| 0.9111111111111111 | 0 |
| 0.9118055555555555 | 0 |
| 0.9125 | 0 |
| 0.9131944444444445 | 0 |
| 0.9138888888888889 | 0 |
| 0.9145833333333333 | 0 |
| 0.9152777777777777 | 0 |
| 0.9159722222222223 | 0 |
| 0.9166666666666666 | 0 |
| 0.9173611111111111 | 0 |
| 0.9180555555555556 | 0 |
| 0.9187500000000001 | 0 |
| 0.9194444444444444 | 0 |
| 0.9201388888888888 | 0 |
| 0.9208333333333334 | 0 |
| 0.9215277777777778 | 0 |
| 0.9222222222222222 | 0 |
| 0.9229166666666666 | 0 |
| 0.9236111111111112 | 0 |
| 0.9243055555555556 | 0 |
| 0.9249999999999999 | 0 |
| 0.9256944444444444 | 0 |
| 0.9263888888888889 | 0 |
| 0.9270833333333334 | 0 |
| 0.9277777777777777 | 0 |
| 0.9284722222222223 | 0 |
| 0.9291666666666667 | 0 |
| 0.9298611111111111 | 0 |
| 0.9305555555555555 | 0 |
| 0.93125 | 0 |
| 0.9319444444444445 | 0 |
| 0.9326388888888889 | 0 |
| 0.9333333333333332 | 0 |
| 0.9340277777777778 | 0 |
| 0.9347222222222222 | 0 |
| 0.9354166666666667 | 0 |
| 0.936111111111111 | 0 |
| 0.9368055555555556 | 0 |
| 0.9375 | 0 |
| 0.9381944444444444 | 0 |
| 0.938888888888889 | 0 |
| 0.9395833333333333 | 0 |
| 0.9402777777777778 | 0 |
| 0.9409722222222222 | 0 |
| 0.9416666666666668 | 0 |
| 0.9423611111111111 | 0 |
| 0.9430555555555555 | 0 |
| 0.94375 | 0 |
| 0.9444444444444445 | 0 |
| 0.9451388888888889 | 0 |
| 0.9458333333333333 | 0 |
| 0.9465277777777777 | 0 |
| 0.9472222222222223 | 0 |
| 0.9479166666666666 | 0 |
| 0.9486111111111111 | 0 |
| 0.9493055555555556 | 0 |
| 0.9500000000000001 | 0 |
| 0.9506944444444444 | 0 |
| 0.9513888888888888 | 0 |
| 0.9520833333333334 | 0 |
| 0.9527777777777778 | 0 |
| 0.9534722222222222 | 0 |
| 0.9541666666666666 | 0 |
| 0.9548611111111112 | 0 |
| 0.9555555555555556 | 0 |
| 0.9562499999999999 | 0 |
| 0.9569444444444444 | 0 |
| 0.9576388888888889 | 0 |
| 0.9583333333333334 | 0 |
| 0.9590277777777777 | 0 |
| 0.9597222222222223 | 0 |
| 0.9604166666666667 | 0 |
| 0.9611111111111111 | 0 |
| 0.9618055555555555 | 0 |
| 0.9625 | 0 |
| 0.9631944444444445 | 0 |
| 0.9638888888888889 | 0 |
| 0.9645833333333332 | 0 |
| 0.9652777777777778 | 0 |
| 0.9659722222222222 | 0 |
| 0.9666666666666667 | 0 |
| 0.967361111111111 | 0 |
| 0.9680555555555556 | 0 |
| 0.96875 | 0 |
| 0.9694444444444444 | 0 |
| 0.970138888888889 | 0 |
| 0.9708333333333333 | 0 |
| 0.9715277777777778 | 0 |
| 0.9722222222222222 | 0 |
| 0.9729166666666668 | 0 |
| 0.9736111111111111 | 0 |
| 0.9743055555555555 | 0 |
| 0.975 | 0 |
| 0.9756944444444445 | 0 |
| 0.9763888888888889 | 0 |
| 0.9770833333333333 | 0 |
| 0.9777777777777777 | 0 |
| 0.9784722222222223 | 0 |
| 0.9791666666666666 | 0 |
| 0.9798611111111111 | 0 |
| 0.9805555555555556 | 0 |
| 0.9812500000000001 | 0 |
| 0.9819444444444444 | 0 |
| 0.9826388888888888 | 0 |
| 0.9833333333333334 | 0 |
| 0.9840277777777778 | 0 |
| 0.9847222222222222 | 0 |
| 0.9854166666666666 | 0 |
| 0.9861111111111112 | 0 |
| 0.9868055555555556 | 0 |
| 0.9874999999999999 | 0 |
| 0.9881944444444444 | 0 |
| 0.9888888888888889 | 0 |
| 0.9895833333333334 | 0 |
| 0.9902777777777777 | 0 |
| 0.9909722222222223 | 0 |
| 0.9916666666666667 | 0 |
| 0.9923611111111111 | 0 |
| 0.9930555555555555 | 0 |
| 0.99375 | 0 |
| 0.9944444444444445 | 0 |
| 0.9951388888888889 | 0 |
| 0.9958333333333332 | 0 |
| 0.9965277777777778 | 0 |
| 0.9972222222222222 | 0 |
| 0.9979166666666667 | 0 |
| 0.998611111111111 | 0 |
| 0.9993055555555556 | 0 |